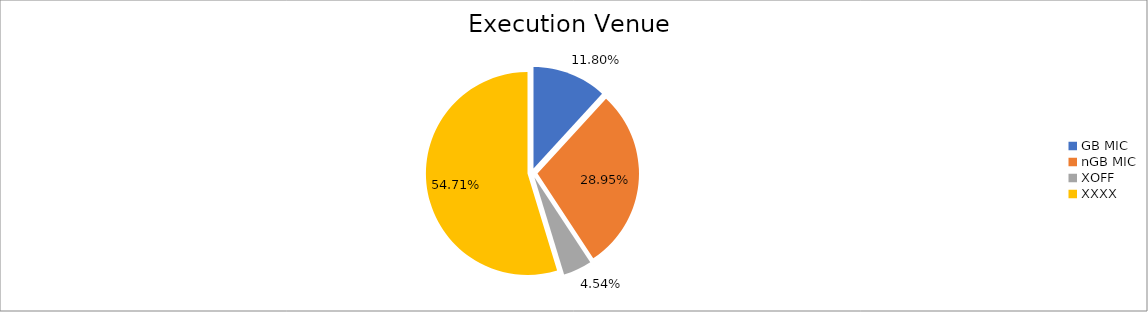
| Category | Series 0 |
|---|---|
| GB MIC | 1076783.538 |
| nGB MIC | 2642376.501 |
| XOFF | 414189.127 |
| XXXX | 4993813.797 |